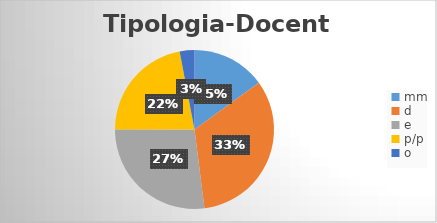
| Category | Series 0 |
|---|---|
| mm | 0.15 |
| d | 0.33 |
| e | 0.27 |
| p/p | 0.22 |
| o | 0.03 |